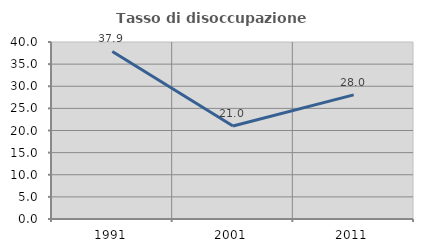
| Category | Tasso di disoccupazione giovanile  |
|---|---|
| 1991.0 | 37.856 |
| 2001.0 | 21.026 |
| 2011.0 | 28.046 |